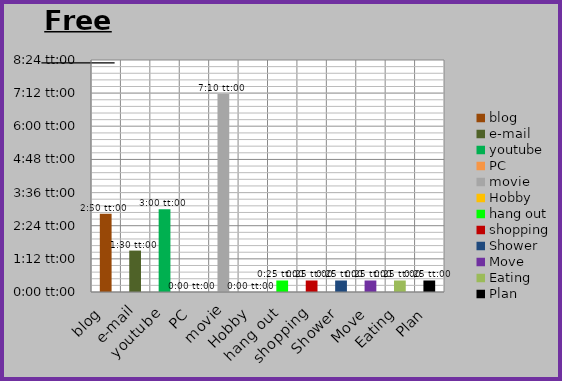
| Category | Free time |
|---|---|
| blog | 0.118 |
| e-mail | 0.062 |
| youtube | 0.125 |
| PC | 0 |
| movie | 0.299 |
| Hobby | 0 |
| hang out | 0.017 |
| shopping | 0.017 |
| Shower | 0.017 |
| Move | 0.017 |
| Eating | 0.017 |
| Plan | 0.017 |